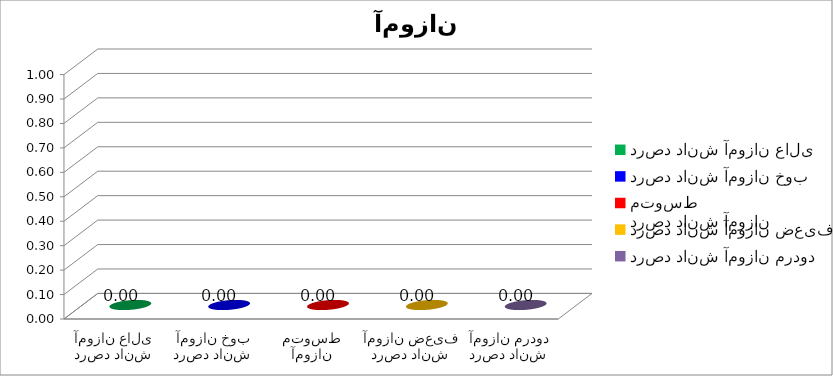
| Category | Series 0 |
|---|---|
| درصد دانش آموزان عالی | 0 |
| درصد دانش آموزان خوب | 0 |
| درصد دانش آموزان متوسط | 0 |
| درصد دانش آموزان ضعیف | 0 |
| درصد دانش آموزان مردود | 0 |